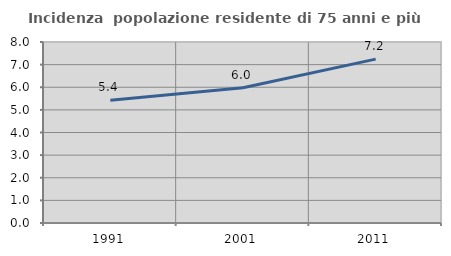
| Category | Incidenza  popolazione residente di 75 anni e più |
|---|---|
| 1991.0 | 5.422 |
| 2001.0 | 5.975 |
| 2011.0 | 7.242 |